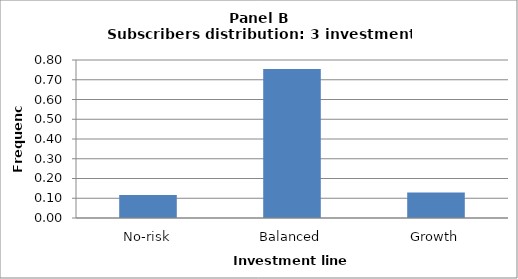
| Category | Series 0 |
|---|---|
| No-risk | 0.116 |
| Balanced | 0.754 |
| Growth | 0.13 |